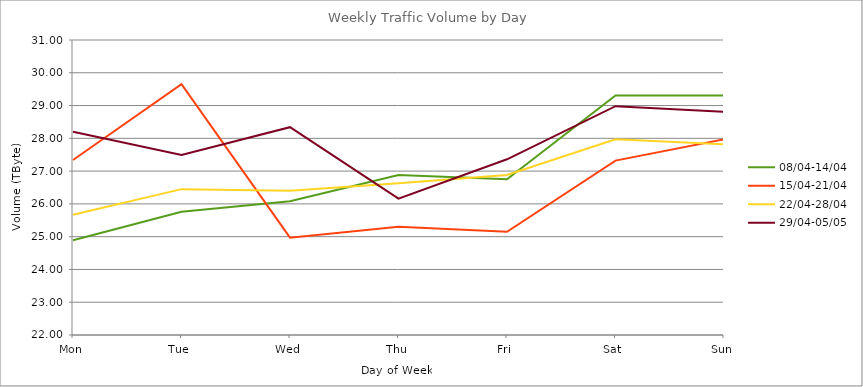
| Category | 08/04-14/04 | 15/04-21/04 | 22/04-28/04 | 29/04-05/05 |
|---|---|---|---|---|
| Mon | 24.89 | 27.34 | 25.67 | 28.2 |
| Tue | 25.76 | 29.65 | 26.45 | 27.49 |
| Wed | 26.08 | 24.97 | 26.4 | 28.34 |
| Thu | 26.88 | 25.3 | 26.63 | 26.16 |
| Fri | 26.75 | 25.15 | 26.88 | 27.36 |
| Sat | 29.31 | 27.32 | 27.97 | 28.98 |
| Sun | 29.31 | 27.97 | 27.82 | 28.81 |